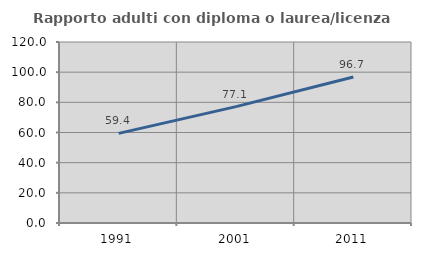
| Category | Rapporto adulti con diploma o laurea/licenza media  |
|---|---|
| 1991.0 | 59.42 |
| 2001.0 | 77.143 |
| 2011.0 | 96.744 |